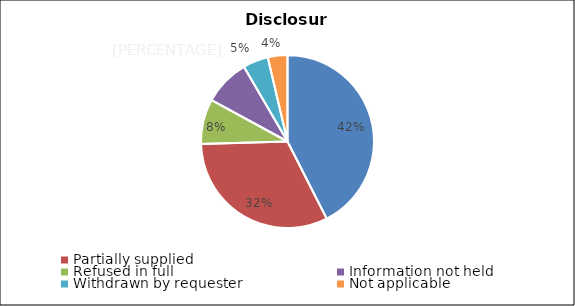
| Category | Series 0 |
|---|---|
| Disclosed in full | 162 |
| Partially supplied | 122 |
| Refused in full | 32 |
| Information not held | 33 |
| Withdrawn by requester | 18 |
| Not applicable | 14 |